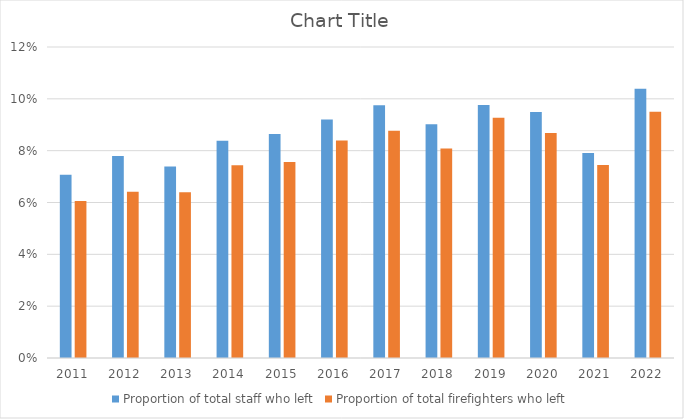
| Category | Proportion of total staff who left | Proportion of total firefighters who left |
|---|---|---|
| 2011.0 | 0.071 | 0.061 |
| 2012.0 | 0.078 | 0.064 |
| 2013.0 | 0.074 | 0.064 |
| 2014.0 | 0.084 | 0.074 |
| 2015.0 | 0.086 | 0.076 |
| 2016.0 | 0.092 | 0.084 |
| 2017.0 | 0.097 | 0.088 |
| 2018.0 | 0.09 | 0.081 |
| 2019.0 | 0.098 | 0.093 |
| 2020.0 | 0.095 | 0.087 |
| 2021.0 | 0.079 | 0.074 |
| 2022.0 | 0.104 | 0.095 |